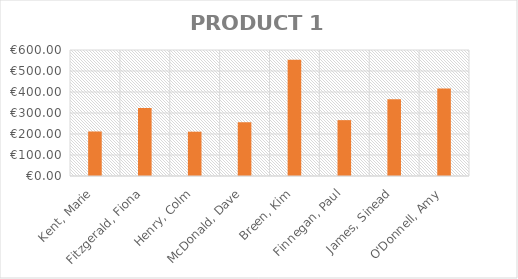
| Category | Series 0 |
|---|---|
| Kent, Marie | 212 |
| Fitzgerald, Fiona | 324 |
| Henry, Colm | 211 |
| McDonald, Dave | 256 |
| Breen, Kim | 554 |
| Finnegan, Paul | 266 |
| James, Sinead | 366 |
| O'Donnell, Amy | 417 |